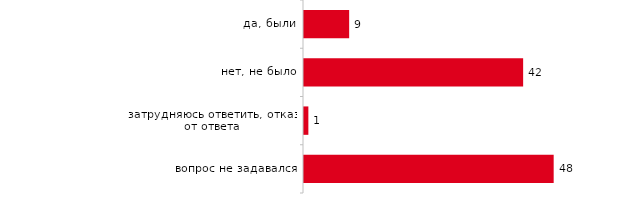
| Category | Series 0 |
|---|---|
| да, были | 8.713 |
| нет, не было | 42.277 |
| затрудняюсь ответить, отказ от ответа | 0.842 |
| вопрос не задавался | 48.168 |